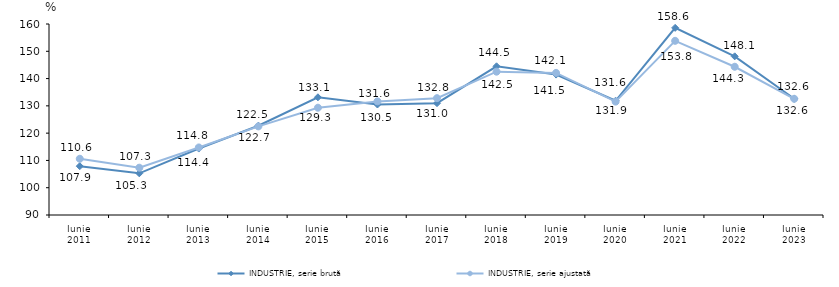
| Category | INDUSTRIE, serie brută | INDUSTRIE, serie ajustată |
|---|---|---|
| Iunie
2011 | 107.898 | 110.612 |
| Iunie
2012 | 105.279 | 107.333 |
| Iunie
2013 | 114.352 | 114.753 |
| Iunie
2014 | 122.717 | 122.484 |
| Iunie
2015 | 133.137 | 129.319 |
| Iunie
2016 | 130.492 | 131.633 |
| Iunie
2017 | 130.976 | 132.817 |
| Iunie
2018 | 144.499 | 142.527 |
| Iunie
2019 | 141.459 | 142.085 |
| Iunie
2020 | 131.857 | 131.561 |
| Iunie
2021 | 158.589 | 153.836 |
| Iunie
2022 | 148.149 | 144.329 |
| Iunie
2023 | 132.585 | 132.593 |